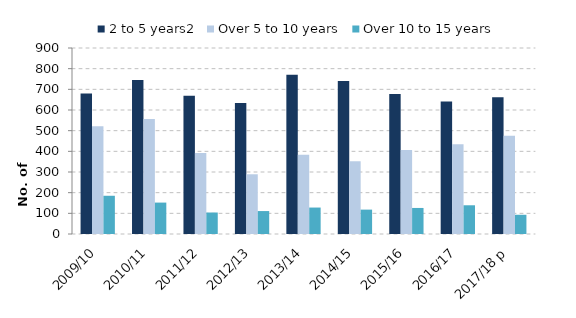
| Category | 2 to 5 years2 | Over 5 to 10 years | Over 10 to 15 years |
|---|---|---|---|
| 2009/10 | 680 | 521 | 185 |
| 2010/11 | 745 | 556 | 152 |
| 2011/12 | 669 | 392 | 104 |
| 2012/13 | 634 | 289 | 111 |
| 2013/14 | 771 | 383 | 128 |
| 2014/15 | 740 | 352 | 118 |
| 2015/16 | 678 | 407 | 126 |
| 2016/17 | 641 | 434 | 139 |
| 2017/18 p | 662 | 476 | 93 |